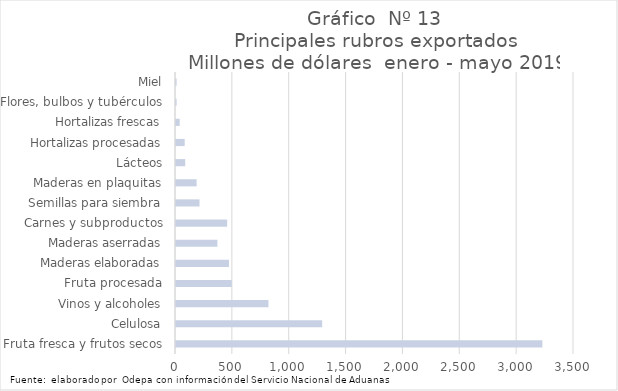
| Category | Series 7 |
|---|---|
| Fruta fresca y frutos secos | 3221735.233 |
| Celulosa | 1285367.24 |
| Vinos y alcoholes | 813012.143 |
| Fruta procesada | 490018.726 |
| Maderas elaboradas | 465895.604 |
| Maderas aserradas | 364267.928 |
| Carnes y subproductos | 450017.054 |
| Semillas para siembra | 206881.427 |
| Maderas en plaquitas | 181368.712 |
| Lácteos | 81001.431 |
| Hortalizas procesadas | 76485.325 |
| Hortalizas frescas | 32578.536 |
| Flores, bulbos y tubérculos | 5366.646 |
| Miel | 5388.853 |